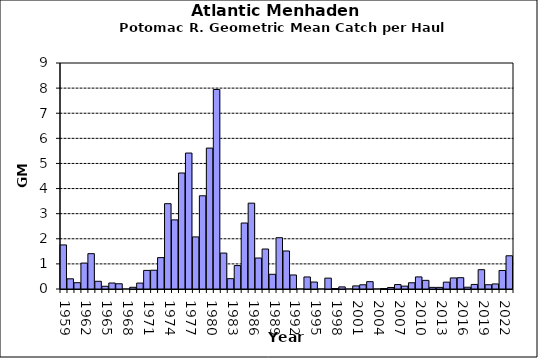
| Category | Series 0 |
|---|---|
| 1959.0 | 1.755 |
| 1960.0 | 0.405 |
| 1961.0 | 0.251 |
| 1962.0 | 1.032 |
| 1963.0 | 1.407 |
| 1964.0 | 0.307 |
| 1965.0 | 0.109 |
| 1966.0 | 0.238 |
| 1967.0 | 0.209 |
| 1968.0 | 0 |
| 1969.0 | 0.068 |
| 1970.0 | 0.235 |
| 1971.0 | 0.741 |
| 1972.0 | 0.748 |
| 1973.0 | 1.25 |
| 1974.0 | 3.398 |
| 1975.0 | 2.752 |
| 1976.0 | 4.619 |
| 1977.0 | 5.414 |
| 1978.0 | 2.074 |
| 1979.0 | 3.712 |
| 1980.0 | 5.612 |
| 1981.0 | 7.946 |
| 1982.0 | 1.431 |
| 1983.0 | 0.411 |
| 1984.0 | 0.933 |
| 1985.0 | 2.627 |
| 1986.0 | 3.418 |
| 1987.0 | 1.234 |
| 1988.0 | 1.592 |
| 1989.0 | 0.586 |
| 1990.0 | 2.043 |
| 1991.0 | 1.514 |
| 1992.0 | 0.559 |
| 1993.0 | 0 |
| 1994.0 | 0.48 |
| 1995.0 | 0.277 |
| 1996.0 | 0 |
| 1997.0 | 0.433 |
| 1998.0 | 0.017 |
| 1999.0 | 0.084 |
| 2000.0 | 0 |
| 2001.0 | 0.123 |
| 2002.0 | 0.168 |
| 2003.0 | 0.292 |
| 2004.0 | 0 |
| 2005.0 | 0.017 |
| 2006.0 | 0.061 |
| 2007.0 | 0.176 |
| 2008.0 | 0.115 |
| 2009.0 | 0.248 |
| 2010.0 | 0.482 |
| 2011.0 | 0.344 |
| 2012.0 | 0.065 |
| 2013.0 | 0.065 |
| 2014.0 | 0.273 |
| 2015.0 | 0.441 |
| 2016.0 | 0.45 |
| 2017.0 | 0.071 |
| 2018.0 | 0.182 |
| 2019.0 | 0.769 |
| 2020.0 | 0.17 |
| 2021.0 | 0.201 |
| 2022.0 | 0.737 |
| 2023.0 | 1.323 |